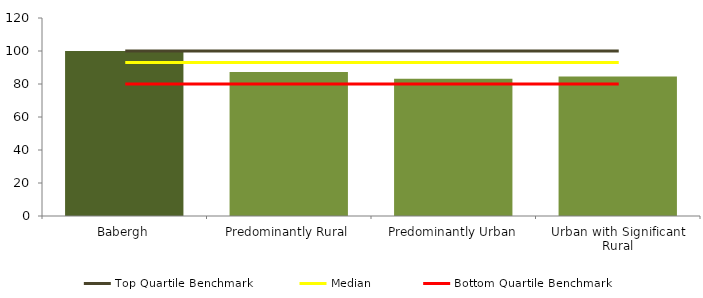
| Category | Series 0 |
|---|---|
| Babergh | 100 |
| Predominantly Rural | 87.292 |
| Predominantly Urban | 83.204 |
| Urban with Significant Rural | 84.537 |